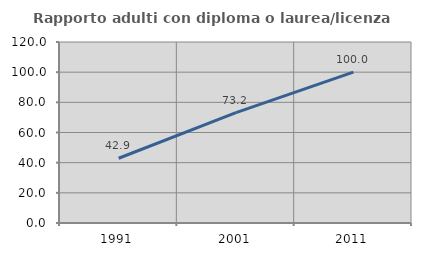
| Category | Rapporto adulti con diploma o laurea/licenza media  |
|---|---|
| 1991.0 | 42.922 |
| 2001.0 | 73.208 |
| 2011.0 | 100 |